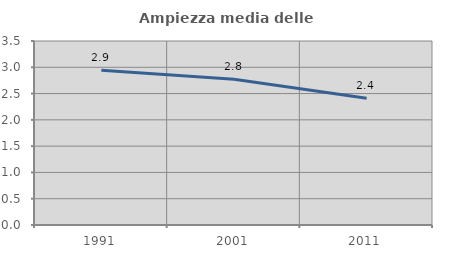
| Category | Ampiezza media delle famiglie |
|---|---|
| 1991.0 | 2.946 |
| 2001.0 | 2.773 |
| 2011.0 | 2.411 |